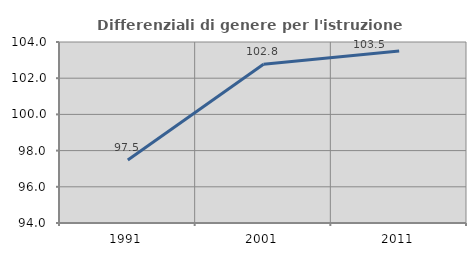
| Category | Differenziali di genere per l'istruzione superiore |
|---|---|
| 1991.0 | 97.483 |
| 2001.0 | 102.769 |
| 2011.0 | 103.502 |